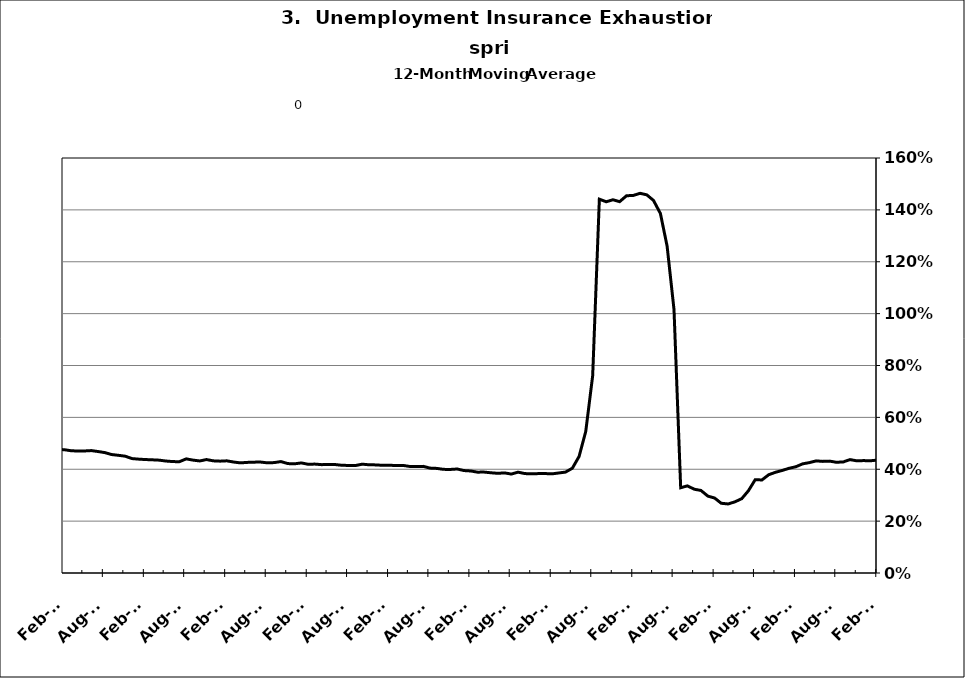
| Category | Series 0 |
|---|---|
| 2002-12-31 | 0.428 |
| 2003-01-31 | 0.432 |
| 2003-02-28 | 0.437 |
| 2003-03-31 | 0.445 |
| 2003-04-30 | 0.455 |
| 2003-05-31 | 0.466 |
| 2003-06-30 | 0.475 |
| 2003-07-31 | 0.485 |
| 2003-08-31 | 0.499 |
| 2003-09-30 | 0.502 |
| 2003-10-31 | 0.5 |
| 2003-11-30 | 0.506 |
| 2003-12-31 | 0.505 |
| 2004-01-31 | 0.505 |
| 2004-02-29 | 0.507 |
| 2004-03-31 | 0.501 |
| 2004-04-30 | 0.491 |
| 2004-05-31 | 0.486 |
| 2004-06-30 | 0.477 |
| 2004-07-31 | 0.466 |
| 2004-08-31 | 0.464 |
| 2004-09-30 | 0.452 |
| 2004-10-31 | 0.448 |
| 2004-11-30 | 0.44 |
| 2004-12-31 | 0.429 |
| 2005-01-31 | 0.429 |
| 2005-02-28 | 0.418 |
| 2005-03-31 | 0.412 |
| 2005-04-30 | 0.409 |
| 2005-05-31 | 0.404 |
| 2005-06-30 | 0.398 |
| 2005-07-31 | 0.4 |
| 2005-08-31 | 0.398 |
| 2005-09-30 | 0.398 |
| 2005-10-31 | 0.398 |
| 2005-11-30 | 0.392 |
| 2005-12-31 | 0.391 |
| 2006-01-31 | 0.388 |
| 2006-02-28 | 0.385 |
| 2006-03-31 | 0.381 |
| 2006-04-30 | 0.383 |
| 2006-05-31 | 0.387 |
| 2006-06-30 | 0.387 |
| 2006-07-31 | 0.393 |
| 2006-08-31 | 0.401 |
| 2006-09-30 | 0.415 |
| 2006-10-31 | 0.422 |
| 2006-11-30 | 0.423 |
| 2006-12-31 | 0.427 |
| 2007-01-31 | 0.425 |
| 2007-02-28 | 0.427 |
| 2007-03-31 | 0.431 |
| 2007-04-30 | 0.437 |
| 2007-05-31 | 0.434 |
| 2007-06-30 | 0.436 |
| 2007-07-30 | 0.443 |
| 2007-08-31 | 0.435 |
| 2007-09-30 | 0.437 |
| 2007-10-31 | 0.433 |
| 2007-11-15 | 0.438 |
| 2007-12-15 09:36:00 | 0.446 |
| 2008-01-14 19:12:00 | 0.447 |
| 2008-02-14 04:48:00 | 0.455 |
| 2008-03-15 14:24:00 | 0.462 |
| 2008-04-15 | 0.462 |
| 2008-05-15 09:36:00 | 0.467 |
| 2008-06-14 19:12:00 | 0.475 |
| 2008-07-15 04:48:00 | 0.47 |
| 2008-08-14 14:24:00 | 0.469 |
| 2008-09-14 | 0.473 |
| 2008-10-14 09:36:00 | 0.478 |
| 2008-11-13 19:12:00 | 0.489 |
| 2008-12-14 04:48:00 | 0.497 |
| 2009-01-13 14:24:00 | 0.51 |
| 2009-02-13 | 0.528 |
| 2009-03-15 09:36:00 | 0.547 |
| 2009-04-14 19:12:00 | 0.565 |
| 2009-05-15 04:48:00 | 0.582 |
| 2009-06-14 14:24:00 | 0.6 |
| 2009-07-15 | 0.611 |
| 2009-08-14 09:36:00 | 0.631 |
| 2009-09-13 19:12:00 | 0.623 |
| 2009-10-14 04:48:00 | 0.631 |
| 2009-11-13 14:24:00 | 0.65 |
| 2009-12-14 | 0.65 |
| 2010-01-13 09:36:00 | 0.657 |
| 2010-02-12 19:12:00 | 0.652 |
| 2010-03-15 04:48:00 | 0.649 |
| 2010-04-14 14:24:00 | 0.636 |
| 2010-05-15 | 0.623 |
| 2010-06-14 09:36:00 | 0.615 |
| 2010-07-14 19:12:00 | 0.604 |
| 2010-08-14 04:48:00 | 0.596 |
| 2010-09-13 14:24:00 | 0.591 |
| 2010-10-14 | 0.608 |
| 2010-11-13 09:36:00 | 0.605 |
| 2010-12-13 19:12:00 | 0.6 |
| 2011-01-13 04:48:00 | 0.602 |
| 2011-02-12 14:24:00 | 0.595 |
| 2011-03-15 | 0.587 |
| 2011-04-14 09:36:00 | 0.584 |
| 2011-05-14 19:12:00 | 0.591 |
| 2011-06-14 04:48:00 | 0.588 |
| 2011-07-14 14:24:00 | 0.582 |
| 2011-08-14 | 0.586 |
| 2011-09-13 09:36:00 | 0.59 |
| 2011-10-13 19:12:00 | 0.576 |
| 2011-11-13 04:48:00 | 0.561 |
| 2011-12-13 14:24:00 | 0.56 |
| 2012-01-13 | 0.555 |
| 2012-02-12 09:36:00 | 0.551 |
| 2012-03-13 19:12:00 | 0.544 |
| 2012-04-13 04:48:00 | 0.544 |
| 2012-05-13 14:24:00 | 0.535 |
| 2012-06-13 | 0.53 |
| 2012-07-13 09:36:00 | 0.535 |
| 2012-08-12 19:12:00 | 0.513 |
| 2012-09-12 04:48:00 | 0.506 |
| 2012-10-12 14:24:00 | 0.494 |
| 2012-11-12 | 0.484 |
| 2012-12-12 09:36:00 | 0.481 |
| 2013-01-11 19:12:00 | 0.465 |
| 2013-02-11 04:48:00 | 0.461 |
| 2013-03-13 14:24:00 | 0.462 |
| 2013-04-13 | 0.459 |
| 2013-05-13 09:36:00 | 0.458 |
| 2013-06-12 19:12:00 | 0.452 |
| 2013-07-13 04:48:00 | 0.451 |
| 2013-08-12 14:24:00 | 0.454 |
| 2013-09-12 | 0.465 |
| 2013-10-12 09:36:00 | 0.463 |
| 2013-11-11 19:12:00 | 0.466 |
| 2013-12-12 04:48:00 | 0.475 |
| 2014-01-11 14:24:00 | 0.477 |
| 2014-02-11 | 0.475 |
| 2014-03-13 09:36:00 | 0.471 |
| 2014-04-12 19:12:00 | 0.47 |
| 2014-05-13 04:48:00 | 0.471 |
| 2014-06-12 14:24:00 | 0.472 |
| 2014-07-13 | 0.468 |
| 2014-08-12 09:36:00 | 0.464 |
| 2014-09-11 19:12:00 | 0.457 |
| 2014-10-12 04:48:00 | 0.454 |
| 2014-11-11 14:24:00 | 0.45 |
| 2014-12-12 | 0.441 |
| 2015-01-11 09:36:00 | 0.439 |
| 2015-02-10 19:12:00 | 0.437 |
| 2015-03-13 04:48:00 | 0.436 |
| 2015-04-12 14:24:00 | 0.435 |
| 2015-05-13 | 0.432 |
| 2015-06-12 09:36:00 | 0.43 |
| 2015-07-12 19:12:00 | 0.429 |
| 2015-08-12 04:48:00 | 0.44 |
| 2015-09-11 14:24:00 | 0.435 |
| 2015-10-12 | 0.432 |
| 2015-11-11 09:36:00 | 0.437 |
| 2015-12-11 19:12:00 | 0.432 |
| 2016-01-11 04:48:00 | 0.431 |
| 2016-02-10 14:24:00 | 0.432 |
| 2016-03-12 | 0.428 |
| 2016-04-11 09:36:00 | 0.425 |
| 2016-05-11 19:12:00 | 0.426 |
| 2016-06-11 04:48:00 | 0.427 |
| 2016-07-11 14:24:00 | 0.428 |
| 2016-08-11 | 0.425 |
| 2016-09-10 09:36:00 | 0.426 |
| 2016-10-10 19:12:00 | 0.43 |
| 2016-11-10 04:48:00 | 0.422 |
| 2016-12-10 14:24:00 | 0.421 |
| 2017-01-10 | 0.424 |
| 2017-02-09 09:36:00 | 0.419 |
| 2017-03-11 19:12:00 | 0.42 |
| 2017-04-11 04:48:00 | 0.418 |
| 2017-05-11 14:24:00 | 0.418 |
| 2017-06-11 | 0.418 |
| 2017-07-11 09:36:00 | 0.415 |
| 2017-08-10 19:12:00 | 0.415 |
| 2017-09-10 04:48:00 | 0.414 |
| 2017-10-10 14:24:00 | 0.42 |
| 2017-11-10 | 0.417 |
| 2017-12-10 09:36:00 | 0.417 |
| 2018-01-09 19:12:00 | 0.415 |
| 2018-02-09 04:48:00 | 0.416 |
| 2018-03-11 14:24:00 | 0.414 |
| 2018-04-11 | 0.415 |
| 2018-05-11 09:36:00 | 0.411 |
| 2018-06-10 19:12:00 | 0.41 |
| 2018-07-11 04:48:00 | 0.411 |
| 2018-08-10 14:24:00 | 0.404 |
| 2018-09-10 | 0.403 |
| 2018-10-10 09:36:00 | 0.4 |
| 2018-11-09 19:12:00 | 0.399 |
| 2018-12-10 04:48:00 | 0.401 |
| 2019-01-09 14:24:00 | 0.395 |
| 2019-02-09 | 0.393 |
| 2019-03-11 09:36:00 | 0.389 |
| 2019-04-10 19:12:00 | 0.389 |
| 2019-05-11 04:48:00 | 0.386 |
| 2019-06-10 14:24:00 | 0.384 |
| 2019-07-11 | 0.386 |
| 2019-08-10 09:36:00 | 0.381 |
| 2019-09-09 19:12:00 | 0.389 |
| 2019-10-10 04:48:00 | 0.383 |
| 2019-11-09 14:24:00 | 0.382 |
| 2019-12-10 | 0.383 |
| 2020-01-09 09:36:00 | 0.383 |
| 2020-02-08 19:12:00 | 0.382 |
| 2020-03-10 04:48:00 | 0.386 |
| 2020-04-09 14:24:00 | 0.389 |
| 2020-05-10 | 0.404 |
| 2020-06-09 09:36:00 | 0.449 |
| 2020-07-09 19:12:00 | 0.546 |
| 2020-08-09 04:48:00 | 0.76 |
| 2020-09-08 14:24:00 | 1.441 |
| 2020-10-09 | 1.431 |
| 2020-11-08 09:36:00 | 1.439 |
| 2020-12-08 19:12:00 | 1.432 |
| 2021-01-08 04:48:00 | 1.455 |
| 2021-02-07 14:24:00 | 1.456 |
| 2021-03-10 | 1.464 |
| 2021-04-09 09:36:00 | 1.458 |
| 2021-05-09 19:12:00 | 1.436 |
| 2021-06-09 04:48:00 | 1.386 |
| 2021-07-09 14:24:00 | 1.261 |
| 2021-08-09 | 1.016 |
| 2021-09-08 09:36:00 | 0.329 |
| 2021-10-08 19:12:00 | 0.336 |
| 2021-11-08 04:48:00 | 0.323 |
| 2021-12-08 14:24:00 | 0.318 |
| 2022-01-08 | 0.296 |
| 2022-02-07 09:36:00 | 0.289 |
| 2022-03-09 19:12:00 | 0.269 |
| 2022-04-09 04:48:00 | 0.266 |
| 2022-05-09 14:24:00 | 0.274 |
| 2022-06-09 | 0.287 |
| 2022-07-09 09:36:00 | 0.317 |
| 2022-08-08 19:12:00 | 0.359 |
| 2022-09-08 04:48:00 | 0.359 |
| 2022-10-08 14:24:00 | 0.379 |
| 2022-11-08 | 0.388 |
| 2022-12-08 09:36:00 | 0.395 |
| 2023-01-07 19:12:00 | 0.404 |
| 2023-02-07 04:48:00 | 0.41 |
| 2023-03-09 14:24:00 | 0.421 |
| 2023-04-09 | 0.426 |
| 2023-05-09 09:36:00 | 0.432 |
| 2023-06-08 19:12:00 | 0.43 |
| 2023-07-09 04:48:00 | 0.431 |
| 2023-08-08 14:24:00 | 0.427 |
| 2023-09-08 | 0.428 |
| 2023-10-08 09:36:00 | 0.437 |
| 2023-11-07 19:12:00 | 0.433 |
| 2023-12-08 04:48:00 | 0.433 |
| 2024-01-07 14:24:00 | 0.433 |
| 2024-02-07 | 0.435 |